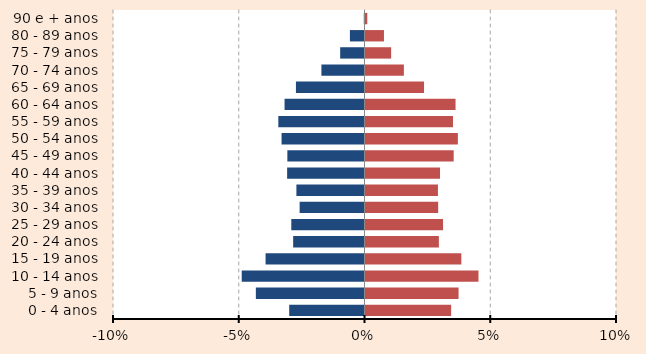
| Category | Series 0 | Homens (%) | Mulheres (%) |
|---|---|---|---|
| 0 - 4 anos |  | -2.994 | 3.445 |
| 5 - 9 anos |  | -4.32 | 3.74 |
| 10 - 14 anos |  | -4.882 | 4.532 |
| 15 - 19 anos |  | -3.933 | 3.85 |
| 20 - 24 anos |  | -2.837 | 2.957 |
| 25 - 29 anos |  | -2.911 | 3.123 |
| 30 - 34 anos |  | -2.579 | 2.929 |
| 35 - 39 anos |  | -2.708 | 2.92 |
| 40 - 44 anos |  | -3.077 | 3.003 |
| 45 - 49 anos |  | -3.067 | 3.546 |
| 50 - 54 anos |  | -3.298 | 3.712 |
| 55 - 59 anos |  | -3.427 | 3.519 |
| 60 - 64 anos |  | -3.178 | 3.62 |
| 65 - 69 anos |  | -2.727 | 2.367 |
| 70 - 74 anos |  | -1.713 | 1.566 |
| 75 - 79 anos |  | -0.967 | 1.059 |
| 80 - 89 anos |  | -0.58 | 0.774 |
| 90 e + anos |  | -0.028 | 0.111 |